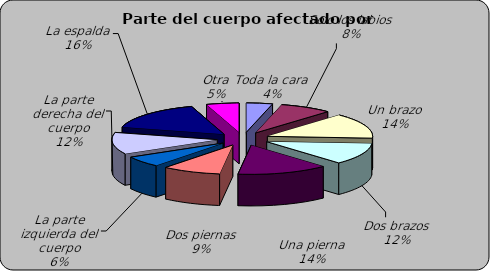
| Category | Series 0 |
|---|---|
| Toda la cara | 0.04 |
| Solo los labios | 0.08 |
| Un brazo | 0.14 |
| Dos brazos | 0.12 |
| Una pierna | 0.14 |
| Dos piernas | 0.09 |
| La parte izquierda del cuerpo | 0.06 |
| La parte derecha del cuerpo | 0.12 |
| La espalda | 0.16 |
| Otra | 0.05 |